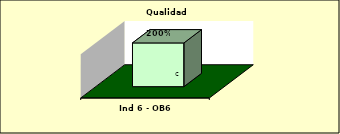
| Category | Series 0 |
|---|---|
| Ind 6 - OB6 | 2 |